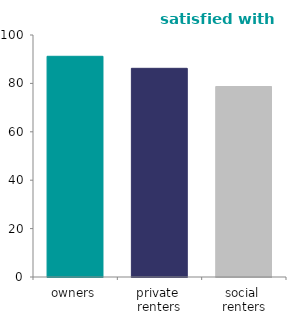
| Category | satisfied with area |
|---|---|
| owners | 91.2 |
| private 
renters | 86.233 |
| social 
renters | 78.715 |